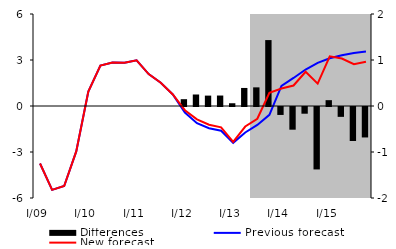
| Category | Differences |
|---|---|
| 0 | 0 |
| 1 | 0 |
| 2 | 0 |
| 3 | 0 |
| 4 | 0 |
| 5 | 0 |
| 6 | 0 |
| 7 | 0 |
| 8 | 0 |
| 9 | 0 |
| 10 | 0 |
| 11 | 0 |
| 12 | 0.148 |
| 13 | 0.25 |
| 14 | 0.226 |
| 15 | 0.228 |
| 16 | 0.06 |
| 17 | 0.392 |
| 18 | 0.405 |
| 19 | 1.433 |
| 20 | -0.173 |
| 21 | -0.493 |
| 22 | -0.146 |
| 23 | -1.357 |
| 24 | 0.127 |
| 25 | -0.214 |
| 26 | -0.74 |
| 27 | -0.662 |